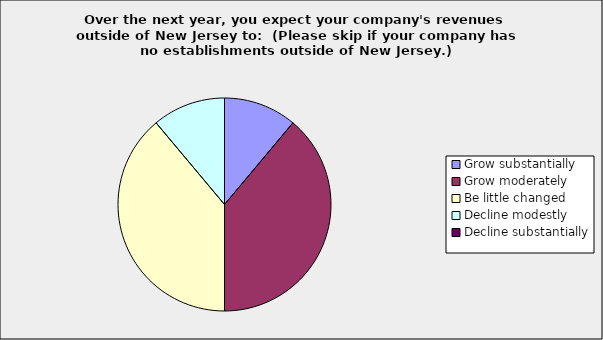
| Category | Series 0 |
|---|---|
| Grow substantially | 0.111 |
| Grow moderately | 0.389 |
| Be little changed | 0.389 |
| Decline modestly | 0.111 |
| Decline substantially | 0 |